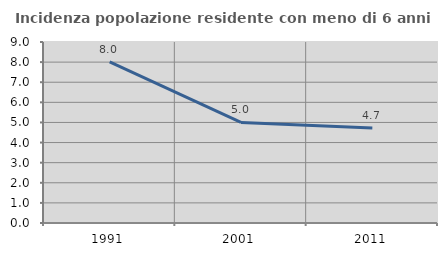
| Category | Incidenza popolazione residente con meno di 6 anni |
|---|---|
| 1991.0 | 8.012 |
| 2001.0 | 5 |
| 2011.0 | 4.724 |